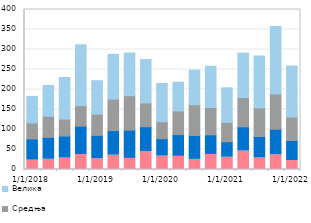
| Category | Микропредузећа | Мала | Средња | Велика |
|---|---|---|---|---|
| 2018-01-01 | 23.458 | 52.774 | 40.183 | 66.517 |
| nan | 25.544 | 54.802 | 52.603 | 77.229 |
| nan | 28.673 | 54.873 | 42.484 | 103.899 |
| nan | 37.41 | 70.984 | 51.038 | 152.215 |
| 2019-01-01 | 26.913 | 58.293 | 53.033 | 83.702 |
| nan | 35.763 | 61.475 | 78.723 | 111.897 |
| nan | 27.759 | 70.634 | 86.103 | 106.825 |
| nan | 44.489 | 62.561 | 59.132 | 108.665 |
| 2020-01-01 | 33.497 | 43.549 | 42.255 | 95.672 |
| nan | 32.96 | 54.335 | 59 | 72.028 |
| nan | 25.293 | 59.78 | 76.792 | 86.501 |
| nan | 37.626 | 49.063 | 68.305 | 103.2 |
| 2021-01-01 | 30.617 | 38.71 | 48.392 | 86.375 |
| nan | 46.211 | 60.56 | 72.812 | 111.3 |
| nan | 28.92 | 53.554 | 71.432 | 129.875 |
| nan | 36.942 | 63.823 | 88.096 | 168.441 |
| 2022-01-01 | 22.354 | 50.182 | 58.632 | 127.609 |